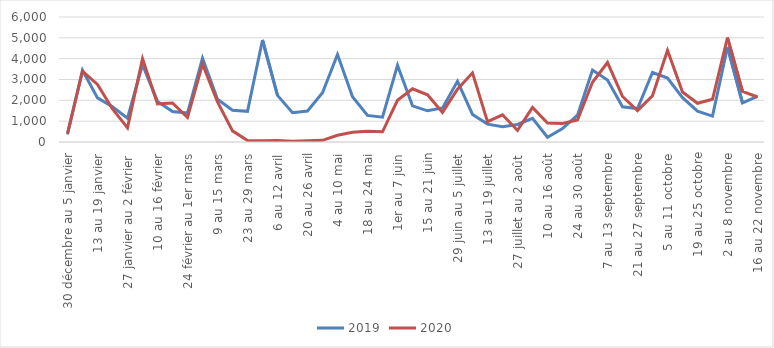
| Category | 2019 | 2020 |
|---|---|---|
| 30 décembre au 5 janvier | 369 | 411 |
| 6 au 12 janvier | 3446 | 3400 |
| 13 au 19 janvier | 2117 | 2765 |
| 20 au 26 janvier | 1689 | 1587 |
| 27 janvier au 2 février | 1140 | 677 |
| 3 au 9 février | 3711 | 4001 |
| 10 au 16 février | 1947 | 1832 |
| 17 au 23 février | 1464 | 1873 |
| 24 février au 1er mars | 1389 | 1177 |
| 2 au 8 mars | 4019 | 3741 |
| 9 au 15 mars | 2049 | 1927 |
| 16 au 22 mars | 1525 | 536 |
| 23 au 29 mars | 1473 | 74 |
| 30 mars au 5 avril | 4896 | 61 |
| 6 au 12 avril | 2237 | 69 |
| 13 au 19 avril | 1410 | 40 |
| 20 au 26 avril | 1489 | 59 |
| 27 avril au 3 mai | 2361 | 79 |
| 4 au 10 mai | 4200 | 324 |
| 11 au 17 mai | 2172 | 463 |
| 18 au 24 mai | 1275 | 517 |
| 25 au 31 mai | 1190 | 488 |
| 1er au 7 juin | 3685 | 2003 |
| 8 au 14 juin | 1736 | 2554 |
| 15 au 21 juin | 1497 | 2264 |
| 22 au 28 juin | 1634 | 1420 |
| 29 juin au 5 juillet | 2913 | 2532 |
| 6 au 12 juillet | 1321 | 3319 |
| 13 au 19 juillet | 858 | 974 |
| 20 au 26 juillet | 730 | 1306 |
| 27 juillet au 2 août | 843 | 556 |
| 3 au 9 août | 1137 | 1657 |
| 10 au 16 août | 229 | 909 |
| 17 au 23 août | 641 | 890 |
| 24 au 30 août | 1291 | 1057 |
| 31 août au 6 septembre | 3457 | 2867 |
| 7 au 13 septembre | 2973 | 3814 |
| 14 au 20 septembre | 1692 | 2185 |
| 21 au 27 septembre | 1603 | 1504 |
| 28 septembre au 4 octobre | 3335 | 2221 |
| 5 au 11 octobre | 3066 | 4404 |
| 12 au 18 octobre | 2128 | 2399 |
| 19 au 25 octobre | 1479 | 1857 |
| 26 octobre au 1er novembre | 1245 | 2052 |
| 2 au 8 novembre | 4560 | 5013 |
| 9 au 15 novembre | 1872 | 2428 |
| 16 au 22 novembre | 2185 | 2159 |